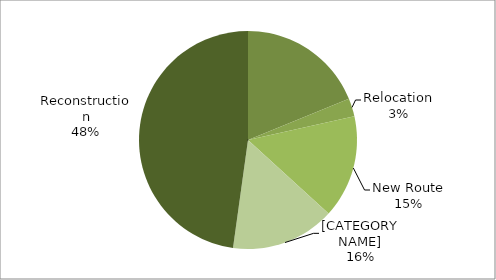
| Category | Series 0 |
|---|---|
| Restoration & Rehab. | 0.19 |
| Relocation | 0.027 |
| New Route | 0.154 |
| Resurfacing | 0.155 |
| Reconstruction | 0.481 |